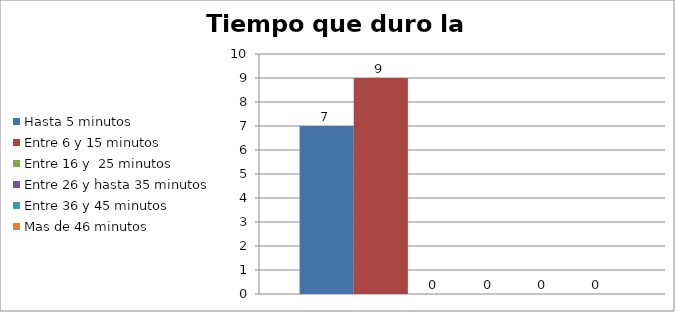
| Category | Hasta 5 minutos | Entre 6 y 15 minutos  | Entre 16 y  25 minutos | Entre 26 y hasta 35 minutos | Entre 36 y 45 minutos  | Mas de 46 minutos |
|---|---|---|---|---|---|---|
| 0 | 7 | 9 | 0 | 0 | 0 | 0 |